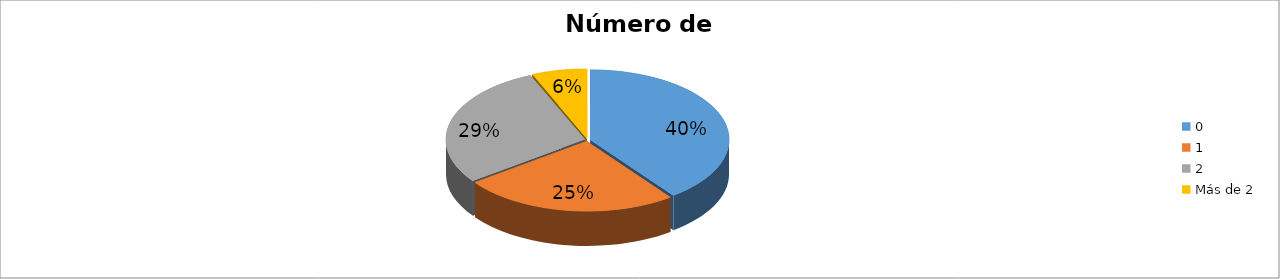
| Category | Series 0 |
|---|---|
| 0 | 0.398 |
| 1 | 0.251 |
| 2 | 0.287 |
| Más de 2 | 0.064 |